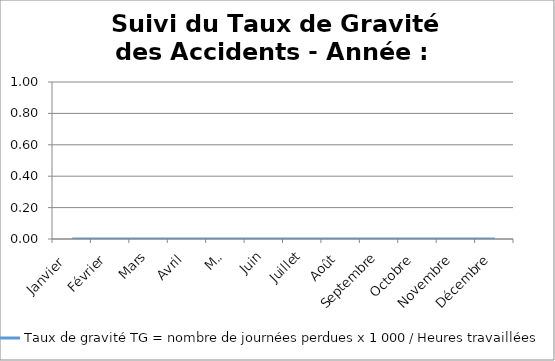
| Category | Taux de gravité TG = nombre de journées perdues x 1 000 / Heures travaillées |
|---|---|
| Janvier  | 0 |
| Février | 0 |
| Mars | 0 |
| Avril | 0 |
| Mai | 0 |
| Juin | 0 |
| Juillet | 0 |
| Août | 0 |
| Septembre | 0 |
| Octobre | 0 |
| Novembre | 0 |
| Décembre | 0 |